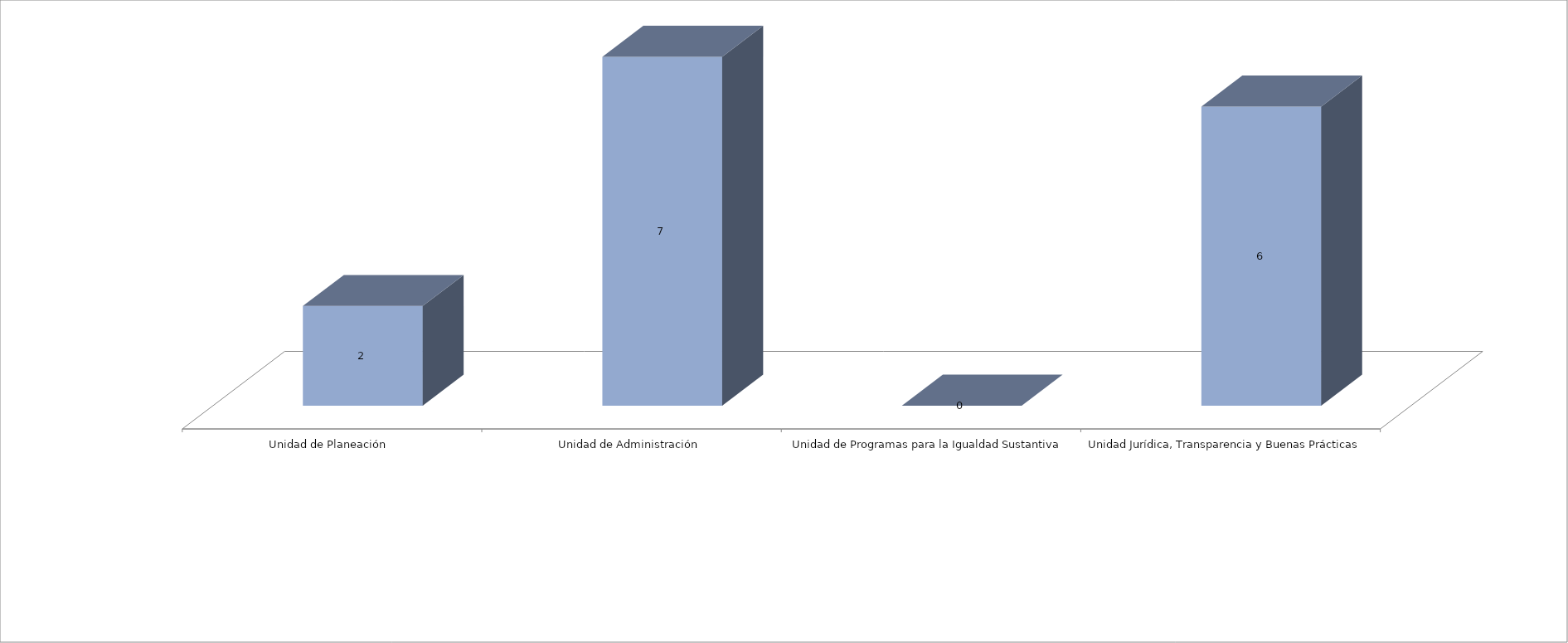
| Category | Series 0 | Series 1 |
|---|---|---|
| Unidad de Planeación  |  | 2 |
| Unidad de Administración |  | 7 |
| Unidad de Programas para la Igualdad Sustantiva |  | 0 |
| Unidad Jurídica, Transparencia y Buenas Prácticas  |  | 6 |